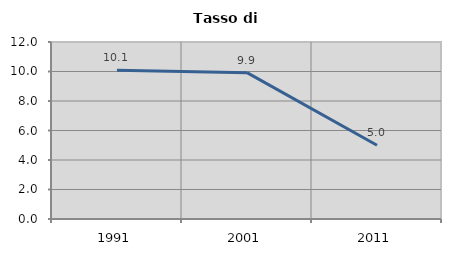
| Category | Tasso di disoccupazione   |
|---|---|
| 1991.0 | 10.081 |
| 2001.0 | 9.924 |
| 2011.0 | 5 |